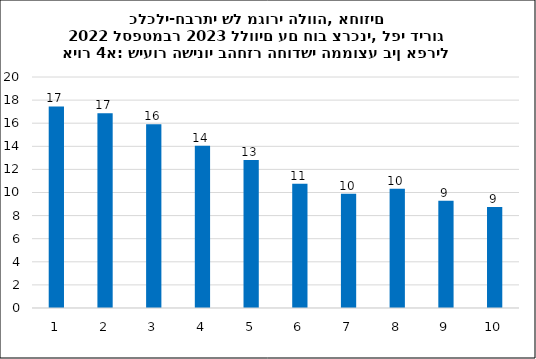
| Category | שיעור השינוי בפועל |
|---|---|
| 1.0 | 17.456 |
| 2.0 | 16.851 |
| 3.0 | 15.901 |
| 4.0 | 14.041 |
| 5.0 | 12.818 |
| 6.0 | 10.763 |
| 7.0 | 9.883 |
| 8.0 | 10.319 |
| 9.0 | 9.293 |
| 10.0 | 8.75 |